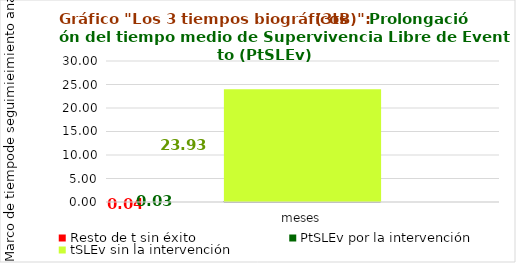
| Category | Resto de t sin éxito | PtSLEv por la intervención | tSLEv sin la intervención |
|---|---|---|---|
| meses | 0.045 | 0.028 | 23.928 |